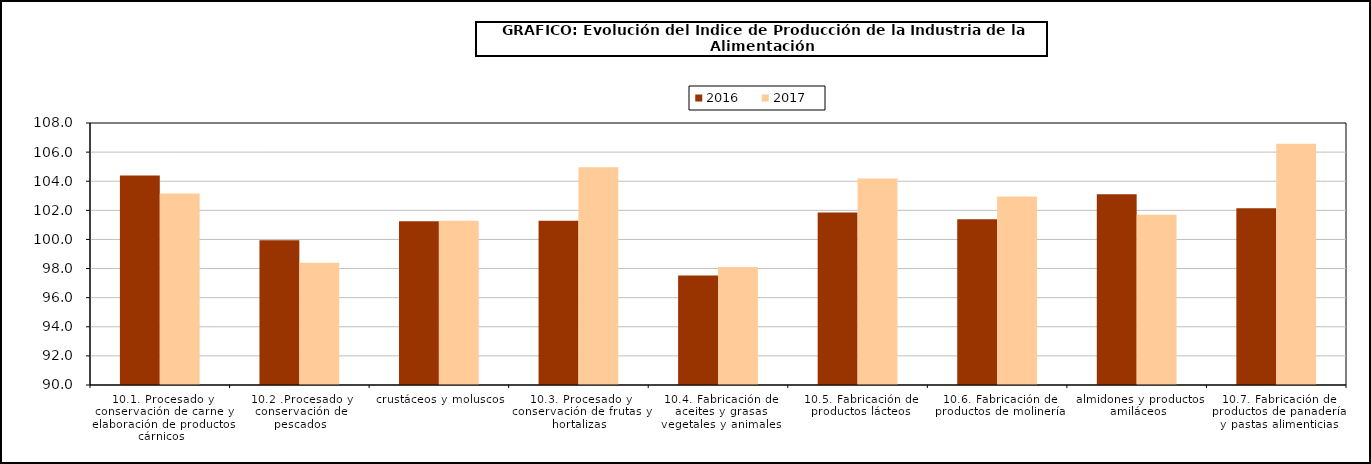
| Category | 2016 | 2017 |
|---|---|---|
| 0 | 104.399 | 103.164 |
| 1 | 99.942 | 98.401 |
| 2 | 101.251 | 101.293 |
| 3 | 101.289 | 104.952 |
| 4 | 97.53 | 98.109 |
| 5 | 101.849 | 104.19 |
| 6 | 101.389 | 102.957 |
| 7 | 103.098 | 101.692 |
| 8 | 102.141 | 106.566 |